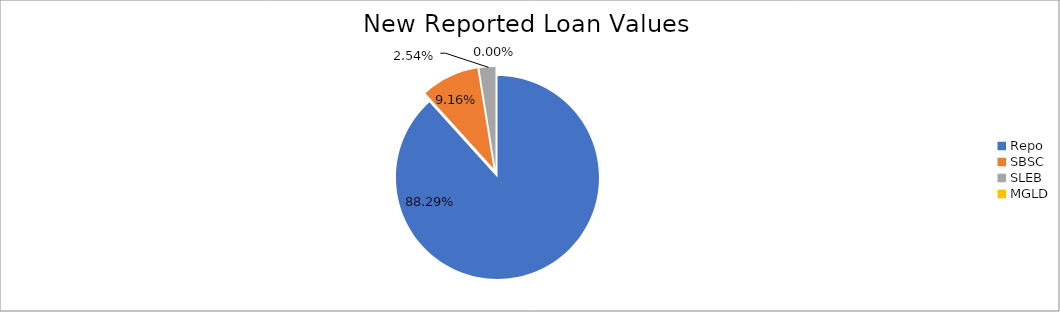
| Category | Series 0 |
|---|---|
| Repo | 10251869.633 |
| SBSC | 1063831.611 |
| SLEB | 295128.933 |
| MGLD | 123.148 |